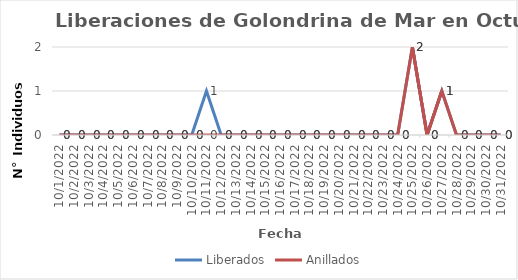
| Category | Liberados | Anillados |
|---|---|---|
| 10/1/22 | 0 | 0 |
| 10/2/22 | 0 | 0 |
| 10/3/22 | 0 | 0 |
| 10/4/22 | 0 | 0 |
| 10/5/22 | 0 | 0 |
| 10/6/22 | 0 | 0 |
| 10/7/22 | 0 | 0 |
| 10/8/22 | 0 | 0 |
| 10/9/22 | 0 | 0 |
| 10/10/22 | 0 | 0 |
| 10/11/22 | 1 | 0 |
| 10/12/22 | 0 | 0 |
| 10/13/22 | 0 | 0 |
| 10/14/22 | 0 | 0 |
| 10/15/22 | 0 | 0 |
| 10/16/22 | 0 | 0 |
| 10/17/22 | 0 | 0 |
| 10/18/22 | 0 | 0 |
| 10/19/22 | 0 | 0 |
| 10/20/22 | 0 | 0 |
| 10/21/22 | 0 | 0 |
| 10/22/22 | 0 | 0 |
| 10/23/22 | 0 | 0 |
| 10/24/22 | 0 | 0 |
| 10/25/22 | 2 | 2 |
| 10/26/22 | 0 | 0 |
| 10/27/22 | 1 | 1 |
| 10/28/22 | 0 | 0 |
| 10/29/22 | 0 | 0 |
| 10/30/22 | 0 | 0 |
| 10/31/22 | 0 | 0 |